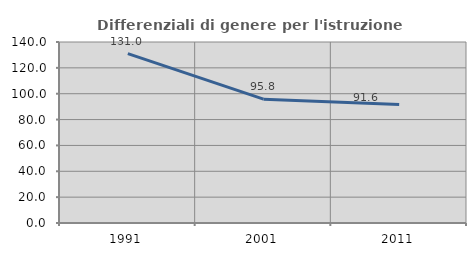
| Category | Differenziali di genere per l'istruzione superiore |
|---|---|
| 1991.0 | 131.022 |
| 2001.0 | 95.805 |
| 2011.0 | 91.64 |